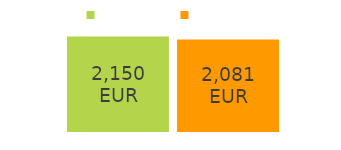
| Category | pajamos | išlaidos |
|---|---|---|
| gaunami pinigai: | 2150 | 2081 |